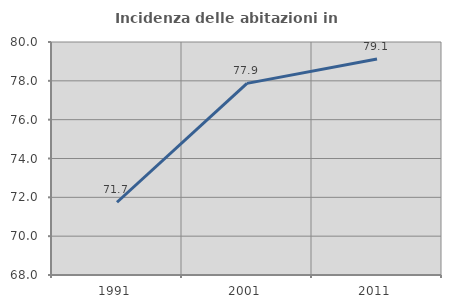
| Category | Incidenza delle abitazioni in proprietà  |
|---|---|
| 1991.0 | 71.747 |
| 2001.0 | 77.87 |
| 2011.0 | 79.119 |